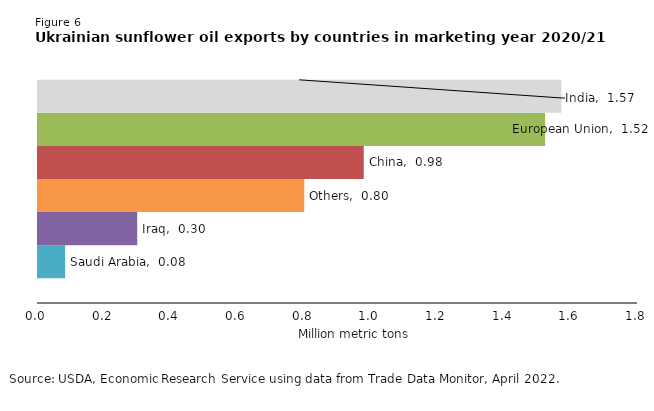
| Category | Saudi Arabia | Iraq | Others | China | European Union | India |
|---|---|---|---|---|---|---|
| 2020/2021 | 0.081 | 0.298 | 0.799 | 0.977 | 1.521 | 1.57 |